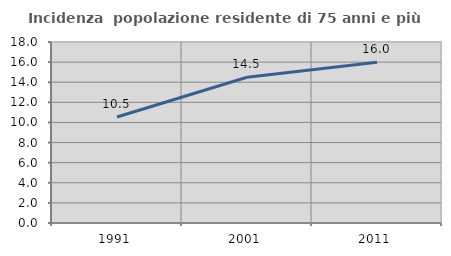
| Category | Incidenza  popolazione residente di 75 anni e più |
|---|---|
| 1991.0 | 10.537 |
| 2001.0 | 14.493 |
| 2011.0 | 15.995 |